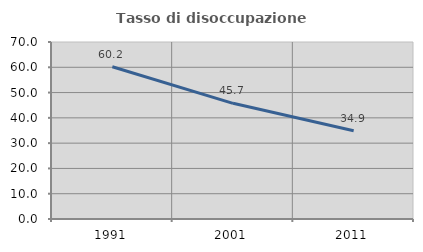
| Category | Tasso di disoccupazione giovanile  |
|---|---|
| 1991.0 | 60.204 |
| 2001.0 | 45.745 |
| 2011.0 | 34.884 |